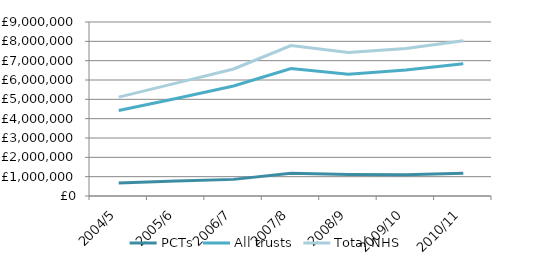
| Category | PCTs | All trusts | Total NHS |
|---|---|---|---|
| 2004/5 | 675303.147 | 4421465.134 | 5115514.281 |
| 2005/6 | 778520.871 | 5047095.5 | 5839664.371 |
| 2006/7 | 859911 | 5692813.68 | 6568362.68 |
| 2007/8 | 1174841 | 6597634.073 | 7784592.073 |
| 2008/9 | 1109565.855 | 6302210.063 | 7426030.918 |
| 2009/10 | 1099782.371 | 6516513.758 | 7635390.129 |
| 2010/11 | 1171813 | 6839898 | 8025361 |